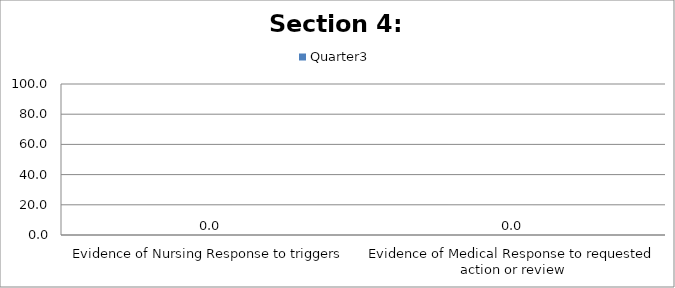
| Category | Quarter3 |
|---|---|
| Evidence of Nursing Response to triggers | 0 |
| Evidence of Medical Response to requested action or review | 0 |